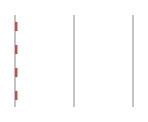
| Category | Series 0 |
|---|---|
| 0 | 0.012 |
| 1 | 0.012 |
| 2 | 0.012 |
| 3 | 0.012 |